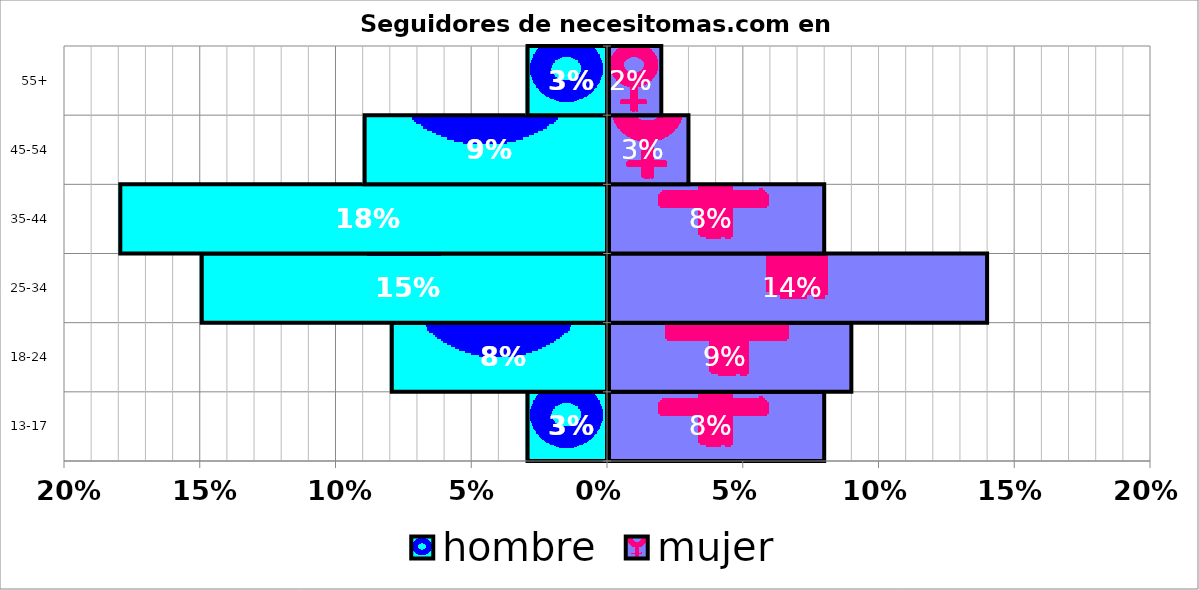
| Category | hombre | mujer |
|---|---|---|
| 13-17 | -0.03 | 0.08 |
| 18-24 | -0.08 | 0.09 |
| 25-34 | -0.15 | 0.14 |
| 35-44 | -0.18 | 0.08 |
| 45-54 | -0.09 | 0.03 |
| 55+ | -0.03 | 0.02 |